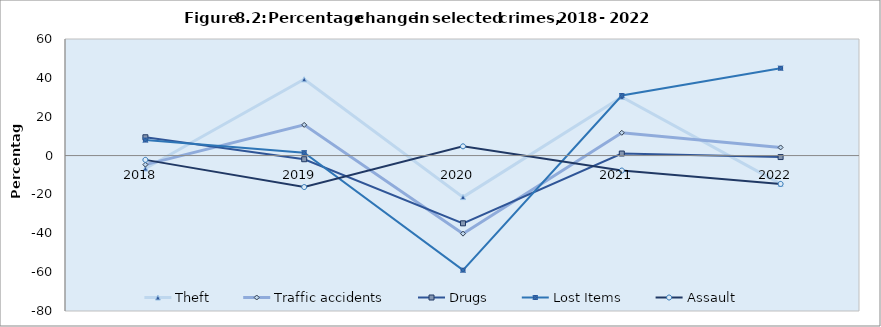
| Category | Theft | Traffic accidents | Drugs | Lost Items | Assault |
|---|---|---|---|---|---|
| 2018.0 | -6.651 | -4.656 | 9.421 | 7.976 | -2.208 |
| 2019.0 | 39.266 | 15.795 | -1.883 | 1.511 | -16.202 |
| 2020.0 | -21.366 | -40.189 | -34.872 | -58.986 | 4.754 |
| 2021.0 | 30.187 | 11.727 | 1.053 | 30.914 | -7.716 |
| 2022.0 | -14.586 | 4.185 | -0.764 | 44.969 | -14.59 |